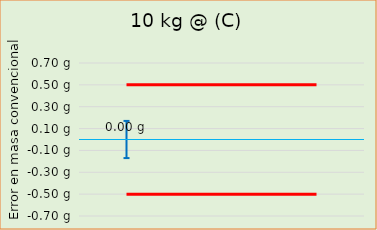
| Category | Error en masa convencional  |  ± EMP |
|---|---|---|
| 0 |  | -0.5 |
| 1 |  | -0.5 |
| 2 |  | -0.5 |